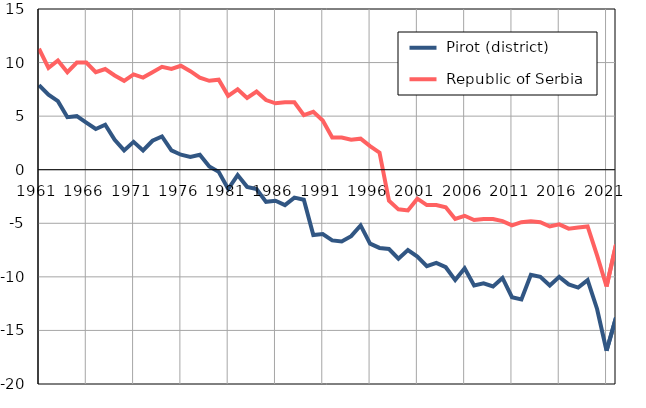
| Category |  Pirot (district) |  Republic of Serbia |
|---|---|---|
| 1961.0 | 7.9 | 11.3 |
| 1962.0 | 7 | 9.5 |
| 1963.0 | 6.4 | 10.2 |
| 1964.0 | 4.9 | 9.1 |
| 1965.0 | 5 | 10 |
| 1966.0 | 4.4 | 10 |
| 1967.0 | 3.8 | 9.1 |
| 1968.0 | 4.2 | 9.4 |
| 1969.0 | 2.8 | 8.8 |
| 1970.0 | 1.8 | 8.3 |
| 1971.0 | 2.6 | 8.9 |
| 1972.0 | 1.8 | 8.6 |
| 1973.0 | 2.7 | 9.1 |
| 1974.0 | 3.1 | 9.6 |
| 1975.0 | 1.8 | 9.4 |
| 1976.0 | 1.4 | 9.7 |
| 1977.0 | 1.2 | 9.2 |
| 1978.0 | 1.4 | 8.6 |
| 1979.0 | 0.3 | 8.3 |
| 1980.0 | -0.2 | 8.4 |
| 1981.0 | -1.8 | 6.9 |
| 1982.0 | -0.5 | 7.5 |
| 1983.0 | -1.6 | 6.7 |
| 1984.0 | -1.8 | 7.3 |
| 1985.0 | -3 | 6.5 |
| 1986.0 | -2.9 | 6.2 |
| 1987.0 | -3.3 | 6.3 |
| 1988.0 | -2.6 | 6.3 |
| 1989.0 | -2.8 | 5.1 |
| 1990.0 | -6.1 | 5.4 |
| 1991.0 | -6 | 4.6 |
| 1992.0 | -6.6 | 3 |
| 1993.0 | -6.7 | 3 |
| 1994.0 | -6.2 | 2.8 |
| 1995.0 | -5.2 | 2.9 |
| 1996.0 | -6.9 | 2.2 |
| 1997.0 | -7.3 | 1.6 |
| 1998.0 | -7.4 | -2.9 |
| 1999.0 | -8.3 | -3.7 |
| 2000.0 | -7.5 | -3.8 |
| 2001.0 | -8.1 | -2.7 |
| 2002.0 | -9 | -3.3 |
| 2003.0 | -8.7 | -3.3 |
| 2004.0 | -9.1 | -3.5 |
| 2005.0 | -10.3 | -4.6 |
| 2006.0 | -9.2 | -4.3 |
| 2007.0 | -10.8 | -4.7 |
| 2008.0 | -10.6 | -4.6 |
| 2009.0 | -10.9 | -4.6 |
| 2010.0 | -10.1 | -4.8 |
| 2011.0 | -11.9 | -5.2 |
| 2012.0 | -12.1 | -4.9 |
| 2013.0 | -9.8 | -4.8 |
| 2014.0 | -10 | -4.9 |
| 2015.0 | -10.8 | -5.3 |
| 2016.0 | -10 | -5.1 |
| 2017.0 | -10.7 | -5.5 |
| 2018.0 | -11 | -5.4 |
| 2019.0 | -10.3 | -5.3 |
| 2020.0 | -13 | -8 |
| 2021.0 | -16.9 | -10.9 |
| 2022.0 | -13.8 | -7 |